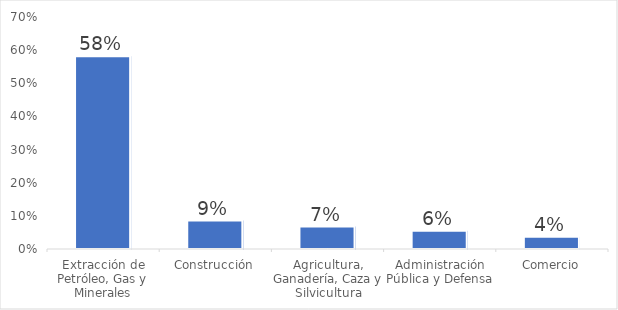
| Category | Series 0 |
|---|---|
| Extracción de Petróleo, Gas y Minerales | 0.582 |
| Construcción | 0.086 |
| Agricultura, Ganadería, Caza y Silvicultura | 0.068 |
| Administración Pública y Defensa | 0.055 |
| Comercio | 0.037 |